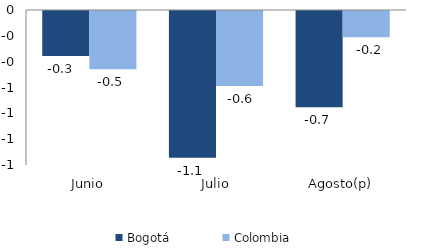
| Category | Bogotá | Colombia |
|---|---|---|
| Junio | -0.348 | -0.452 |
| Julio | -1.137 | -0.58 |
| Agosto(p) | -0.746 | -0.204 |